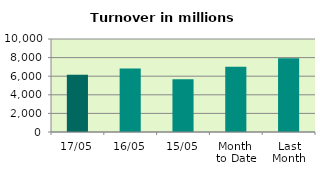
| Category | Series 0 |
|---|---|
| 17/05 | 6150.082 |
| 16/05 | 6815.682 |
| 15/05 | 5682.626 |
| Month 
to Date | 7027.871 |
| Last
Month | 7939.051 |